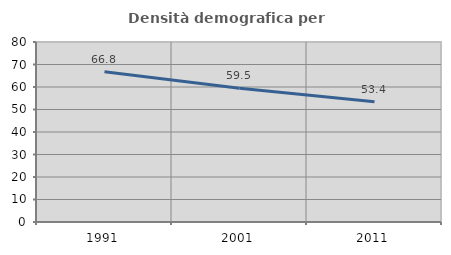
| Category | Densità demografica |
|---|---|
| 1991.0 | 66.774 |
| 2001.0 | 59.455 |
| 2011.0 | 53.432 |